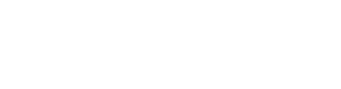
| Category | Average Daily Visitors |
|---|---|
| January | 0.447 |
| February | 0.481 |
| March | 0.461 |
| April | 0.482 |
| May | 0.49 |
| June | 0.448 |
| July | 0.448 |
| August | 0.465 |
| September | 0.425 |
| October | 0.465 |
| November | 0.492 |
| December | 0.455 |